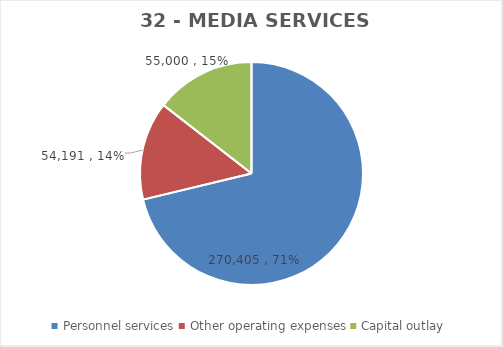
| Category | Series 0 | Series 1 | Series 2 | Series 3 | Series 4 | Series 5 | Series 6 |
|---|---|---|---|---|---|---|---|
| Personnel services | 270405 |  |  | 224126 | 267285 | 270405 | 270405 |
| Other operating expenses | 54191 |  |  | 33720 | 59983 | 61191 | 54191 |
| Capital outlay | 55000 |  |  | 68262 | 55000 | 55000 | 55000 |